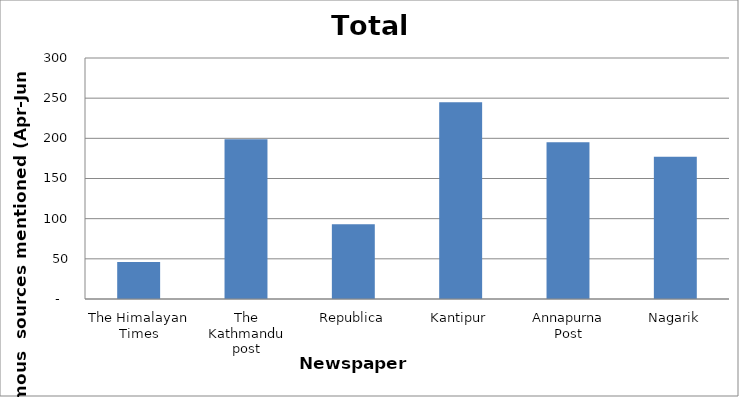
| Category | Total |
|---|---|
| The Himalayan Times | 46 |
| The Kathmandu post | 199 |
| Republica | 93 |
| Kantipur | 245 |
| Annapurna Post | 195 |
| Nagarik | 177 |